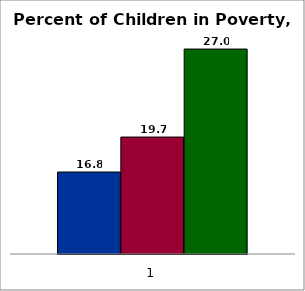
| Category | 50 states and D.C. | SREB states₃ | Series 2 |
|---|---|---|---|
| 0 | 16.8 | 19.7 | 27 |